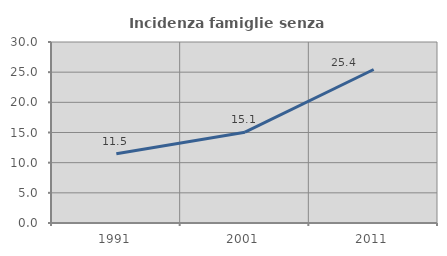
| Category | Incidenza famiglie senza nuclei |
|---|---|
| 1991.0 | 11.464 |
| 2001.0 | 15.052 |
| 2011.0 | 25.44 |